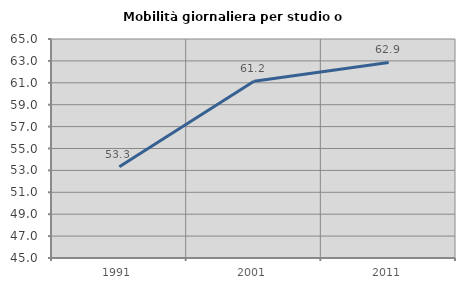
| Category | Mobilità giornaliera per studio o lavoro |
|---|---|
| 1991.0 | 53.331 |
| 2001.0 | 61.151 |
| 2011.0 | 62.856 |